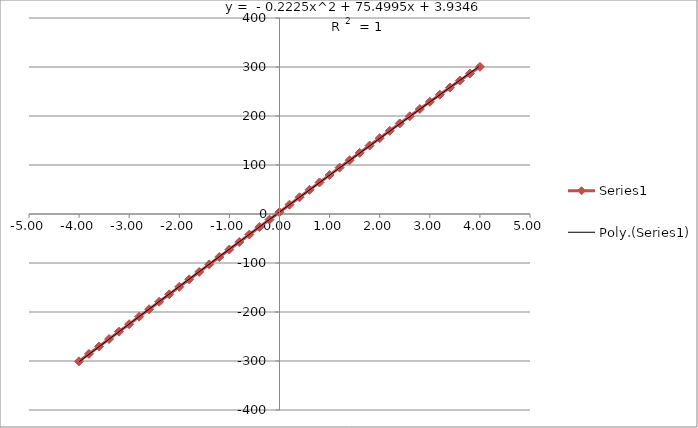
| Category | Series 1 |
|---|---|
| 4.00085 | 300.34 |
| 3.80031 | 286.55 |
| 3.6008 | 272.44 |
| 3.40052 | 257.99 |
| 3.20017 | 243.49 |
| 3.00076 | 228.93 |
| 2.80018 | 214.23 |
| 2.59987 | 199.44 |
| 2.39989 | 184.73 |
| 2.20032 | 169.76 |
| 1.99991 | 154.77 |
| 1.79956 | 139.79 |
| 1.5998899999999998 | 124.77 |
| 1.39945 | 109.7 |
| 1.19943 | 94.64 |
| 0.99969 | 79.54 |
| 0.79941 | 64.4 |
| 0.5988899999999999 | 49.27 |
| 0.39933 | 34.12 |
| 0.19903 | 18.91 |
| -0.00143 | 3.68 |
| -0.20124 | -11.47 |
| -0.40142 | -26.65 |
| -0.60177 | -41.88 |
| -0.8018599999999999 | -57.24 |
| -1.00183 | -72.48 |
| -1.20235 | -87.77 |
| -1.40186 | -102.93 |
| -1.60189 | -118.22 |
| -1.8015 | -133.41 |
| -2.00063 | -148.53 |
| -2.20033 | -163.91 |
| -2.4005099999999997 | -179.09 |
| -2.60162 | -194.4 |
| -2.8014099999999997 | -209.51 |
| -3.0019299999999998 | -224.85 |
| -3.2025799999999998 | -240.1 |
| -3.40236 | -255.18 |
| -3.60273 | -270.38 |
| -3.80279 | -285.52 |
| -4.00276 | -300.68 |